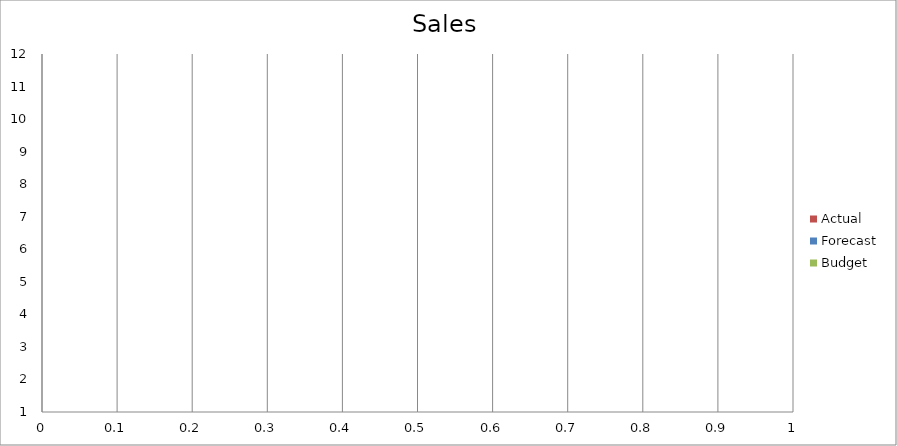
| Category | Budget | Forecast | Actual |
|---|---|---|---|
| 0 | 850 | 2250 | 980 |
| 1 | 2920 | 2380 | 3010 |
| 2 | 3480 | 2500 | 2100 |
| 3 | 2220 | 2340 | 2200 |
| 4 | 1480 | 1360 | 3360 |
| 5 | 3280 | 2720 | 750 |
| 6 | 2950 | 570 | 1740 |
| 7 | 2980 | 1770 | 880 |
| 8 | 590 | 980 | 1110 |
| 9 | 3010 | 1330 | 2210 |
| 10 | 1150 | 2040 | 3330 |
| 11 | 2430 | 1710 | 940 |